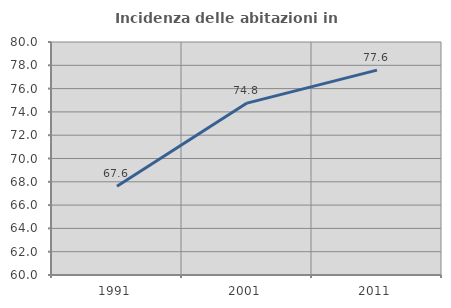
| Category | Incidenza delle abitazioni in proprietà  |
|---|---|
| 1991.0 | 67.62 |
| 2001.0 | 74.755 |
| 2011.0 | 77.586 |